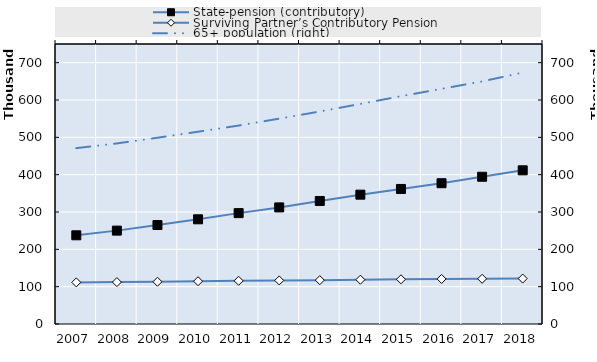
| Category | State-pension (contributory) | Surviving Partner’s Contributory Pension | Series 5 | Series 6 | Series 7 | Series 8 | Series 9 | Series 10 | Series 11 | Series 12 | Series 13 | Series 14 | Series 15 | Series 16 | Series 17 | Series 18 | Series 19 |
|---|---|---|---|---|---|---|---|---|---|---|---|---|---|---|---|---|---|
| 2007.0 | 237599 | 111460 |  |  |  |  |  |  |  |  |  |  |  |  |  |  |  |
| 2008.0 | 250117 | 112237 |  |  |  |  |  |  |  |  |  |  |  |  |  |  |  |
| 2009.0 | 265102 | 113108 |  |  |  |  |  |  |  |  |  |  |  |  |  |  |  |
| 2010.0 | 280419 | 114579 |  |  |  |  |  |  |  |  |  |  |  |  |  |  |  |
| 2011.0 | 296995 | 115762 |  |  |  |  |  |  |  |  |  |  |  |  |  |  |  |
| 2012.0 | 312314 | 116751 |  |  |  |  |  |  |  |  |  |  |  |  |  |  |  |
| 2013.0 | 329531 | 117417 |  |  |  |  |  |  |  |  |  |  |  |  |  |  |  |
| 2014.0 | 346420 | 118670 |  |  |  |  |  |  |  |  |  |  |  |  |  |  |  |
| 2015.0 | 361725 | 119712 |  |  |  |  |  |  |  |  |  |  |  |  |  |  |  |
| 2016.0 | 377062 | 120673 |  |  |  |  |  |  |  |  |  |  |  |  |  |  |  |
| 2017.0 | 394378 | 121091 |  |  |  |  |  |  |  |  |  |  |  |  |  |  |  |
| 2018.0 | 411660 | 121689 |  |  |  |  |  |  |  |  |  |  |  |  |  |  |  |